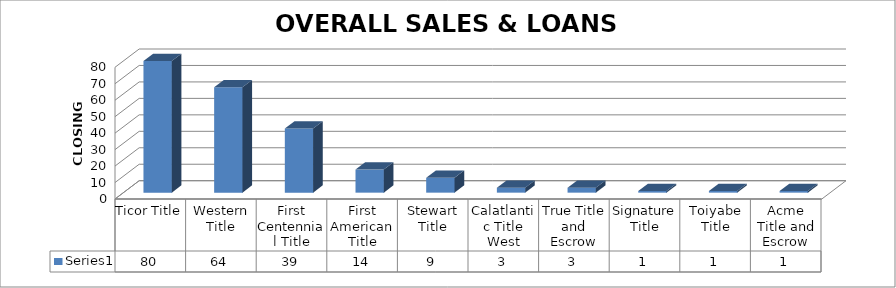
| Category | Series 0 |
|---|---|
| Ticor Title | 80 |
| Western Title | 64 |
| First Centennial Title | 39 |
| First American Title | 14 |
| Stewart Title | 9 |
| Calatlantic Title West | 3 |
| True Title and Escrow | 3 |
| Signature Title | 1 |
| Toiyabe Title | 1 |
| Acme Title and Escrow | 1 |